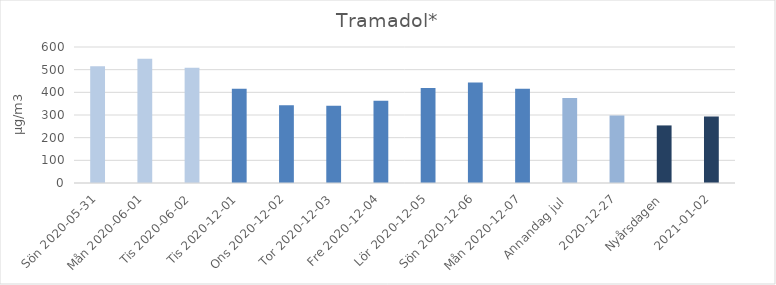
| Category | Tramadol* |
|---|---|
| Sön 2020-05-31 | 515.6 |
| Mån 2020-06-01 | 548.6 |
|  Tis 2020-06-02 | 508 |
| Tis 2020-12-01 | 415.7 |
| Ons 2020-12-02 | 343.2 |
| Tor 2020-12-03 | 340.7 |
| Fre 2020-12-04 | 362.9 |
| Lör 2020-12-05 | 419 |
| Sön 2020-12-06 | 443.8 |
| Mån 2020-12-07 | 416.1 |
| Annandag jul  | 375 |
| 2020-12-27 | 298 |
| Nyårsdagen | 254 |
| 2021-01-02 | 293 |